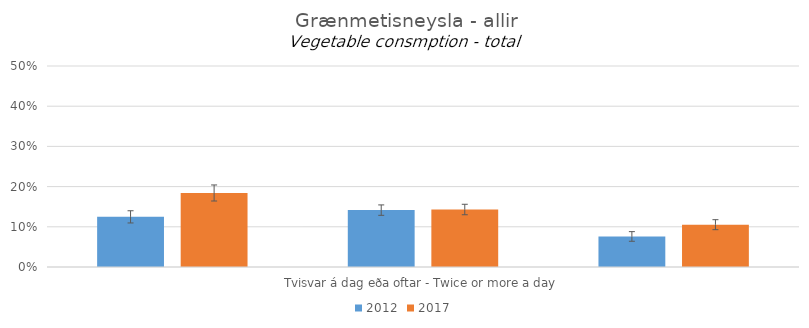
| Category | 2012 | 2017 |
|---|---|---|
| 0 | 0.125 | 0.184 |
| 1 | 0.141 | 0.143 |
| 2 | 0.076 | 0.105 |